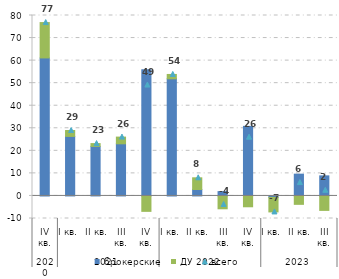
| Category | брокерские | ДУ |
|---|---|---|
| 0 | 61.186 | 15.68 |
| 1 | 26.396 | 2.607 |
| 2 | 21.967 | 1.243 |
| 3 | 23.115 | 2.977 |
| 4 | 55.989 | -6.834 |
| 5 | 51.936 | 1.926 |
| 6 | 2.863 | 5.178 |
| 7 | 1.92 | -5.694 |
| 8 | 30.85 | -4.803 |
| 9 | -0.634 | -6.452 |
| 10 | 9.659 | -3.728 |
| 11 | 8.904 | -6.41 |